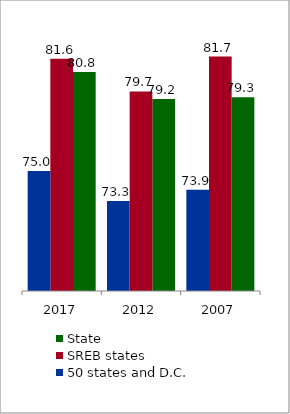
| Category | State | SREB states | 50 states and D.C. |
|---|---|---|---|
| 2007.0 | 79.32 | 81.688 | 73.908 |
| 2012.0 | 79.211 | 79.65 | 73.255 |
| 2017.0 | 80.782 | 81.563 | 75.009 |